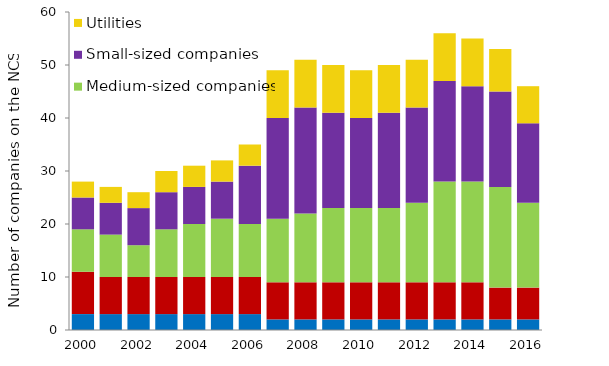
| Category | Large Norwegian companies | Majors | Medium-sized companies | Small-sized companies | Utilities |
|---|---|---|---|---|---|
| 2000.0 | 3 | 8 | 8 | 6 | 3 |
| 2001.0 | 3 | 7 | 8 | 6 | 3 |
| 2002.0 | 3 | 7 | 6 | 7 | 3 |
| 2003.0 | 3 | 7 | 9 | 7 | 4 |
| 2004.0 | 3 | 7 | 10 | 7 | 4 |
| 2005.0 | 3 | 7 | 11 | 7 | 4 |
| 2006.0 | 3 | 7 | 10 | 11 | 4 |
| 2007.0 | 2 | 7 | 12 | 19 | 9 |
| 2008.0 | 2 | 7 | 13 | 20 | 9 |
| 2009.0 | 2 | 7 | 14 | 18 | 9 |
| 2010.0 | 2 | 7 | 14 | 17 | 9 |
| 2011.0 | 2 | 7 | 14 | 18 | 9 |
| 2012.0 | 2 | 7 | 15 | 18 | 9 |
| 2013.0 | 2 | 7 | 19 | 19 | 9 |
| 2014.0 | 2 | 7 | 19 | 18 | 9 |
| 2015.0 | 2 | 6 | 19 | 18 | 8 |
| 2016.0 | 2 | 6 | 16 | 15 | 7 |